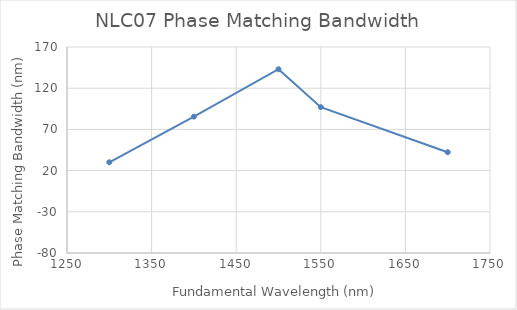
| Category | Phase Matching Bandwidth (nm) |
|---|---|
| 1300.0 | 30.1 |
| 1400.0 | 85.5 |
| 1500.0 | 143 |
| 1550.0 | 97 |
| 1700.0 | 42.3 |